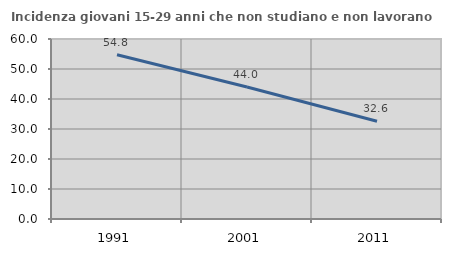
| Category | Incidenza giovani 15-29 anni che non studiano e non lavorano  |
|---|---|
| 1991.0 | 54.762 |
| 2001.0 | 44.007 |
| 2011.0 | 32.574 |